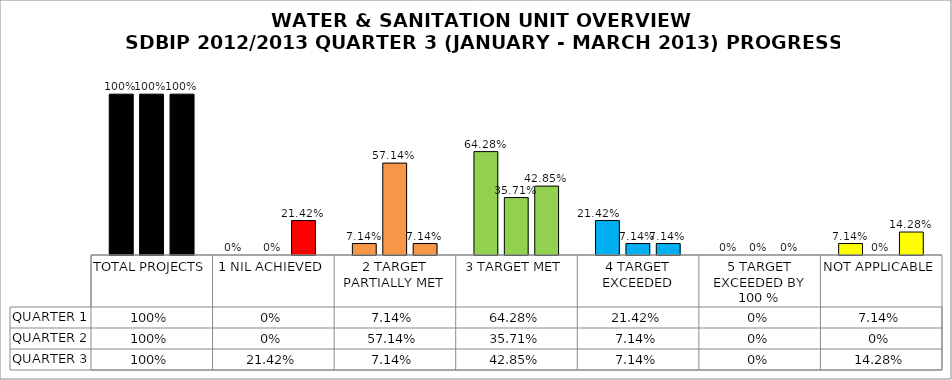
| Category | QUARTER 1 | QUARTER 2 | QUARTER 3 |
|---|---|---|---|
| TOTAL PROJECTS | 1 | 1 | 1 |
| 1 NIL ACHIEVED | 0 | 0 | 0.214 |
| 2 TARGET PARTIALLY MET | 0.071 | 0.571 | 0.071 |
| 3 TARGET MET | 0.643 | 0.357 | 0.428 |
| 4 TARGET EXCEEDED | 0.214 | 0.071 | 0.071 |
| 5 TARGET EXCEEDED BY 100 % | 0 | 0 | 0 |
| NOT APPLICABLE | 0.071 | 0 | 0.143 |